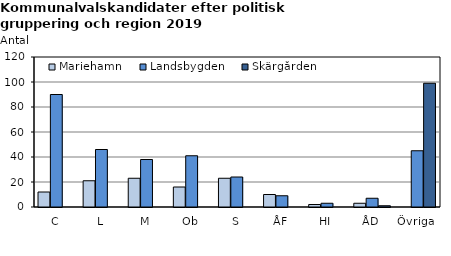
| Category | Mariehamn | Landsbygden | Skärgården |
|---|---|---|---|
| C | 12 | 90 | 0 |
| L | 21 | 46 | 0 |
| M | 23 | 38 | 0 |
| Ob | 16 | 41 | 0 |
| S | 23 | 24 | 0 |
| ÅF | 10 | 9 | 0 |
| HI | 2 | 3 | 0 |
| ÅD | 3 | 7 | 1 |
| Övriga | 0 | 45 | 99 |